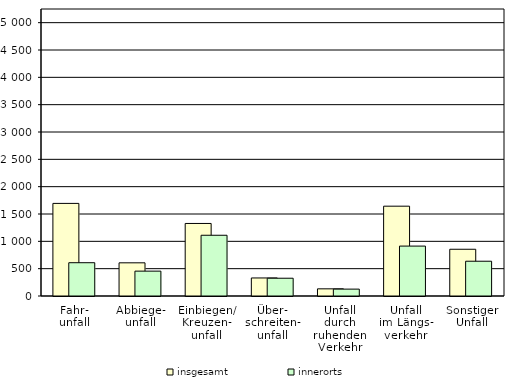
| Category |    insgesamt |    innerorts |
|---|---|---|
| 0 | 1694 | 609 |
| 1 | 607 | 455 |
| 2 | 1327 | 1111 |
| 3 | 330 | 325 |
| 4 | 131 | 126 |
| 5 | 1643 | 913 |
| 6 | 855 | 636 |